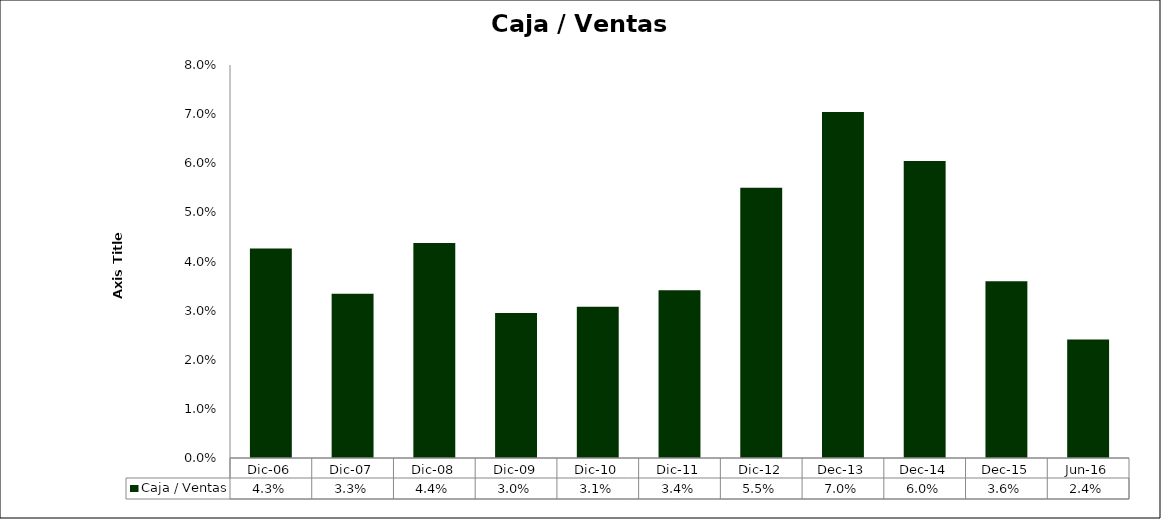
| Category | Caja / Ventas |
|---|---|
| Dic-06 | 0.043 |
| Dic-07 | 0.033 |
| Dic-08 | 0.044 |
| Dic-09 | 0.03 |
| Dic-10 | 0.031 |
| Dic-11 | 0.034 |
| Dic-12 | 0.055 |
| dic-13 | 0.07 |
| dic-14 | 0.06 |
| dic-15 | 0.036 |
| jun-16 | 0.024 |